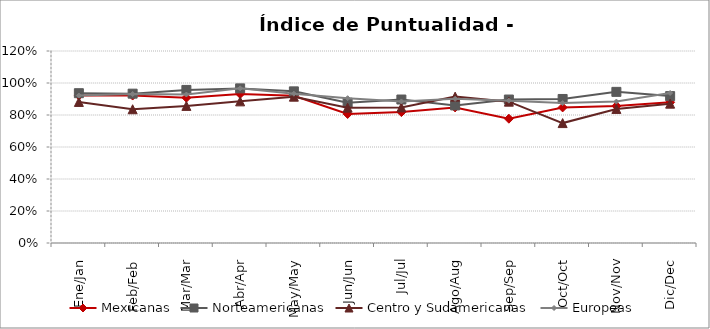
| Category | Mexicanas | Norteamericanas | Centro y Sudamericanas | Europeas |
|---|---|---|---|---|
| Ene/Jan | 0.922 | 0.936 | 0.882 | 0.922 |
| Feb/Feb | 0.922 | 0.933 | 0.836 | 0.931 |
| Mar/Mar | 0.908 | 0.957 | 0.857 | 0.928 |
| Abr/Apr | 0.932 | 0.966 | 0.885 | 0.967 |
| May/May | 0.92 | 0.948 | 0.915 | 0.933 |
| Jun/Jun | 0.806 | 0.877 | 0.846 | 0.905 |
| Jul/Jul | 0.818 | 0.897 | 0.847 | 0.885 |
| Ago/Aug | 0.847 | 0.86 | 0.915 | 0.901 |
| Sep/Sep | 0.777 | 0.897 | 0.883 | 0.89 |
| Oct/Oct | 0.847 | 0.9 | 0.749 | 0.874 |
| Nov/Nov | 0.856 | 0.945 | 0.838 | 0.884 |
| Dic/Dec | 0.879 | 0.918 | 0.871 | 0.938 |